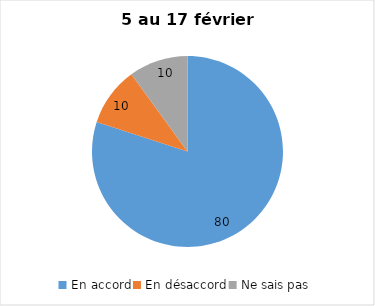
| Category | Series 0 |
|---|---|
| En accord | 80 |
| En désaccord | 10 |
| Ne sais pas | 10 |